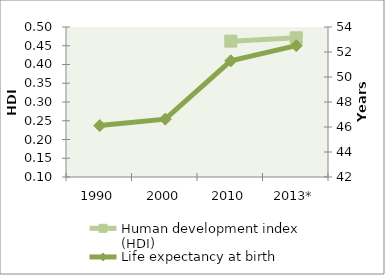
| Category | Human development index (HDI) |
|---|---|
| 1990 | 0 |
| 2000 | 0 |
| 2010 | 0.462 |
| 2013* | 0.471 |